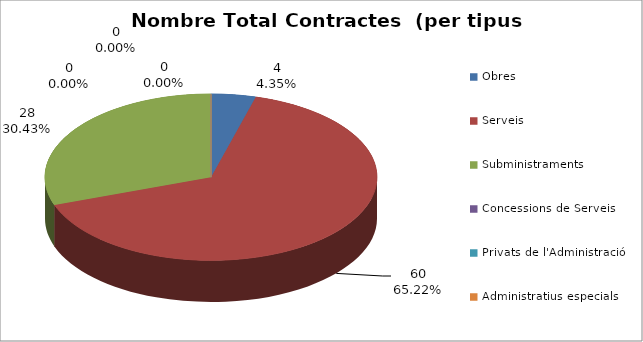
| Category | Nombre Total Contractes |
|---|---|
| Obres | 4 |
| Serveis | 60 |
| Subministraments | 28 |
| Concessions de Serveis | 0 |
| Privats de l'Administració | 0 |
| Administratius especials | 0 |